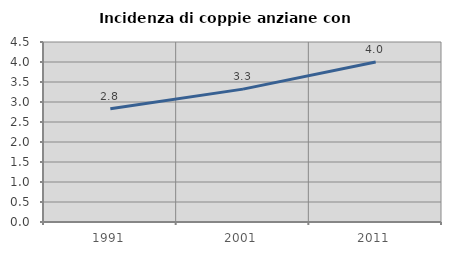
| Category | Incidenza di coppie anziane con figli |
|---|---|
| 1991.0 | 2.83 |
| 2001.0 | 3.322 |
| 2011.0 | 4 |